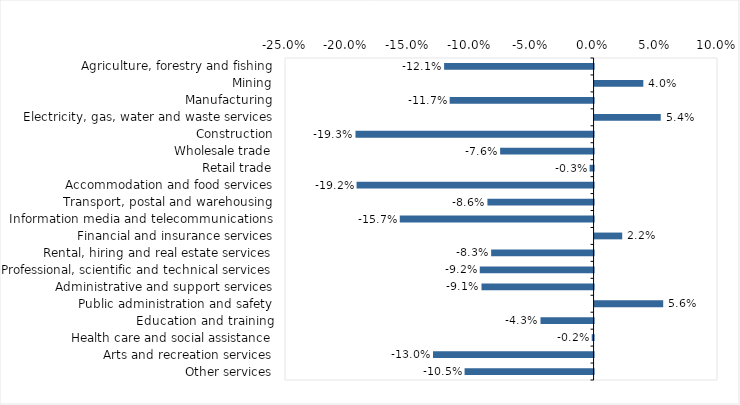
| Category | This week |
|---|---|
| Agriculture, forestry and fishing | -0.121 |
| Mining | 0.04 |
| Manufacturing | -0.117 |
| Electricity, gas, water and waste services | 0.054 |
| Construction | -0.193 |
| Wholesale trade | -0.076 |
| Retail trade | -0.003 |
| Accommodation and food services | -0.192 |
| Transport, postal and warehousing | -0.086 |
| Information media and telecommunications | -0.157 |
| Financial and insurance services | 0.022 |
| Rental, hiring and real estate services | -0.083 |
| Professional, scientific and technical services | -0.092 |
| Administrative and support services | -0.091 |
| Public administration and safety | 0.056 |
| Education and training | -0.043 |
| Health care and social assistance | -0.002 |
| Arts and recreation services | -0.13 |
| Other services | -0.104 |